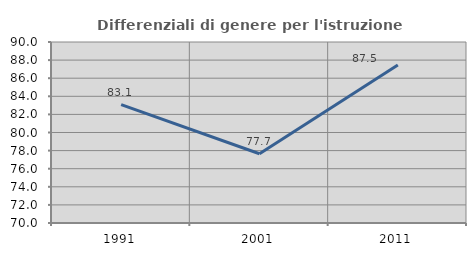
| Category | Differenziali di genere per l'istruzione superiore |
|---|---|
| 1991.0 | 83.083 |
| 2001.0 | 77.655 |
| 2011.0 | 87.453 |